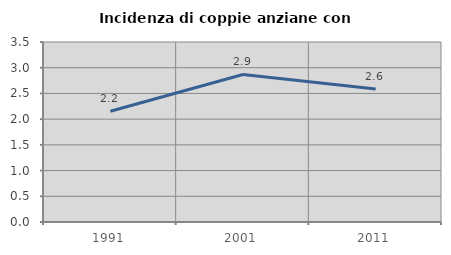
| Category | Incidenza di coppie anziane con figli |
|---|---|
| 1991.0 | 2.153 |
| 2001.0 | 2.869 |
| 2011.0 | 2.588 |